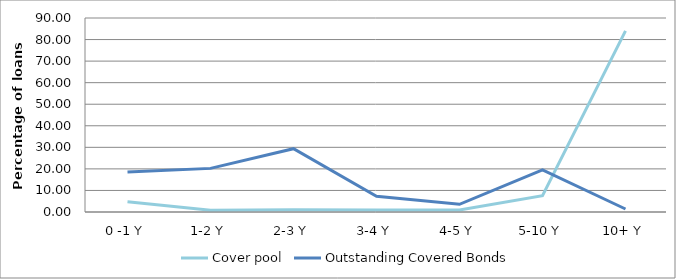
| Category | Cover pool | Outstanding Covered Bonds |
|---|---|---|
| 0 -1 Y | 4.746 | 18.606 |
| 1-2 Y | 0.761 | 20.238 |
| 2-3 Y | 1.039 | 29.378 |
| 3-4 Y | 0.885 | 7.266 |
| 4-5 Y | 0.976 | 3.574 |
| 5-10 Y | 7.602 | 19.539 |
| 10+ Y | 83.992 | 1.399 |